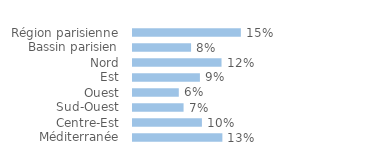
| Category | Series 0 |
|---|---|
| Région parisienne | 0.151 |
| Bassin parisien | 0.081 |
| Nord | 0.124 |
| Est | 0.094 |
| Ouest | 0.064 |
| Sud-Ouest | 0.071 |
| Centre-Est | 0.097 |
| Méditerranée | 0.125 |